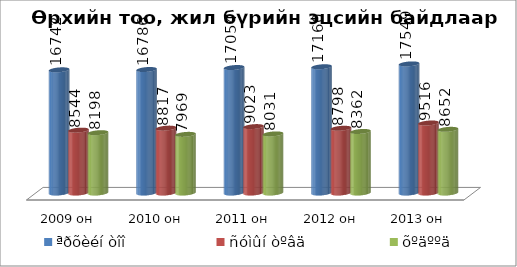
| Category | ªðõèéí òîî  | ñóìûí òºâä | õºäººä |
|---|---|---|---|
| 2009 он | 16742 | 8544 | 8198 |
| 2010 он | 16786 | 8817 | 7969 |
| 2011 он | 17054 | 9023 | 8031 |
| 2012 он | 17160 | 8798 | 8362 |
| 2013 он | 17549 | 9516 | 8652 |